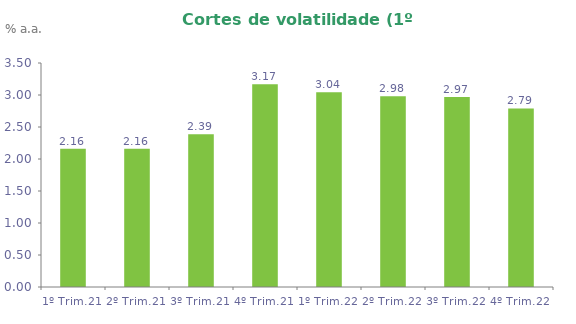
| Category | Series 0 |
|---|---|
| 1º Trim.21 | 2.162 |
| 2º Trim.21 | 2.162 |
| 3º Trim.21 | 2.387 |
| 4º Trim.21 | 3.166 |
| 1º Trim.22 | 3.042 |
| 2º Trim.22 | 2.981 |
| 3º Trim.22 | 2.97 |
| 4º Trim.22 | 2.79 |